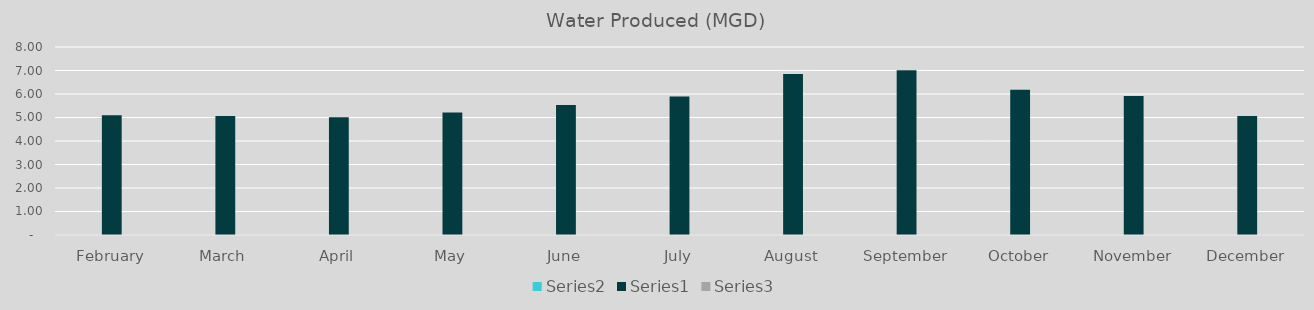
| Category | Series 1 | Series 0 | Series 2 |
|---|---|---|---|
| February | 0 | 5.1 | 0 |
| March | 0 | 5.06 | 0 |
| April | 0 | 5.01 | 0 |
| May | 0 | 5.21 | 0 |
| June | 0 | 5.53 | 0 |
| July | 0 | 5.89 | 0 |
| August | 0 | 6.85 | 0 |
| September | 0 | 7.01 | 0 |
| October | 0 | 6.18 | 0 |
| November | 0 | 5.91 | 0 |
| December | 0 | 5.06 | 0 |